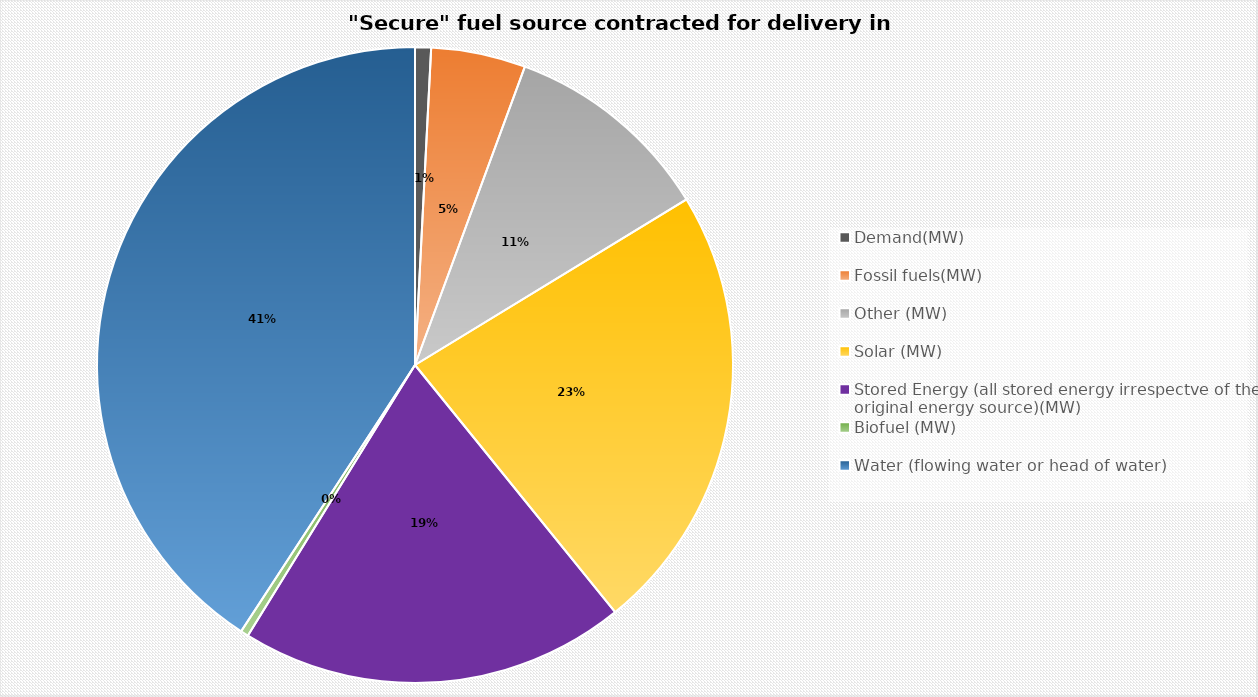
| Category | Secure fuel source contracted for delivery in 22/23  |
|---|---|
| Demand(MW) | 2.836 |
| Fossil fuels(MW) | 16.8 |
| Other (MW) | 37.313 |
| Solar (MW) | 80 |
| Stored Energy (all stored energy irrespectve of the original energy source)(MW) | 68.681 |
| Biofuel (MW) | 1.4 |
| Water (flowing water or head of water) | 142.65 |